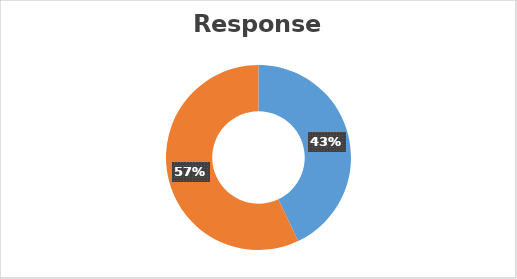
| Category | Total |
|---|---|
| Sum of Field1 | 42.952 |
| Sum of Non Resp Rate | 57.048 |